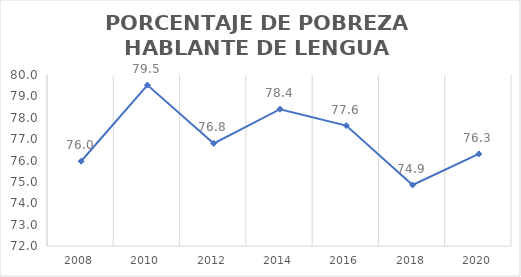
| Category | Series 0 |
|---|---|
| 2008.0 | 75.966 |
| 2010.0 | 79.528 |
| 2012.0 | 76.799 |
| 2014.0 | 78.401 |
| 2016.0 | 77.633 |
| 2018.0 | 74.855 |
| 2020.0 | 76.308 |